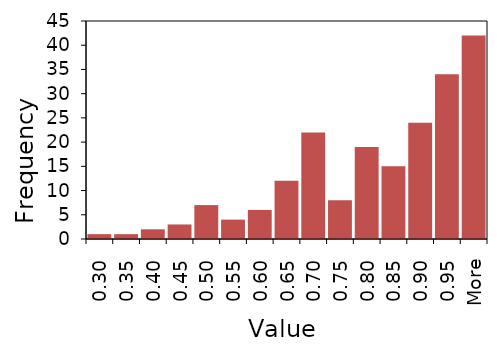
| Category | Series 1 |
|---|---|
| 0.30 | 1 |
| 0.35 | 1 |
| 0.40 | 2 |
| 0.45 | 3 |
| 0.50 | 7 |
| 0.55 | 4 |
| 0.60 | 6 |
| 0.65 | 12 |
| 0.70 | 22 |
| 0.75 | 8 |
| 0.80 | 19 |
| 0.85 | 15 |
| 0.90 | 24 |
| 0.95 | 34 |
| More | 42 |